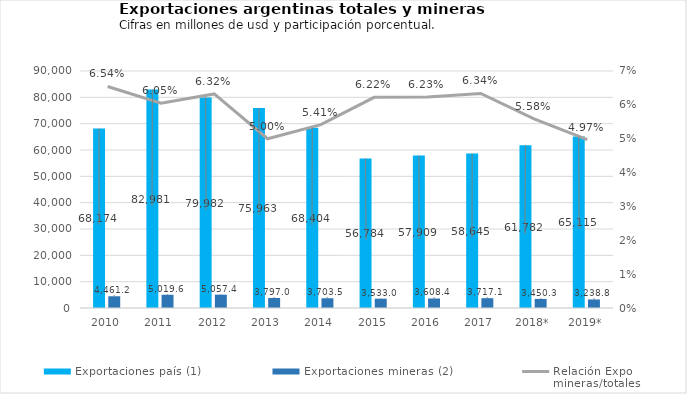
| Category | Exportaciones país (1) | Exportaciones mineras (2) |
|---|---|---|
| 2010 | 68174440 | 4461188 |
| 2011 | 82981086 | 5019615 |
| 2012 | 79982381 | 5057366 |
| 2013 | 75962976 | 3796985 |
| 2014 | 68404346.618 | 3703455 |
| 2015 | 56783952.504 | 3533021 |
| 2016 | 57909097 | 3608428 |
| 2017 | 58644734 | 3717126 |
| 2018* | 61781529 | 3450325 |
| 2019* | 65115327 | 3238846 |